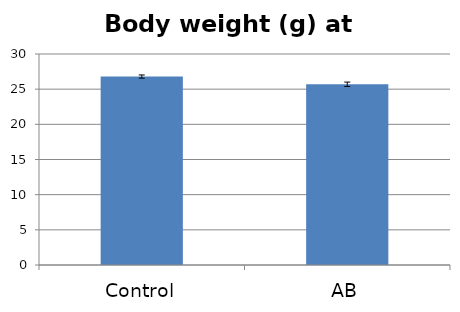
| Category | Average |
|---|---|
| Control | 26.796 |
| AB | 25.694 |